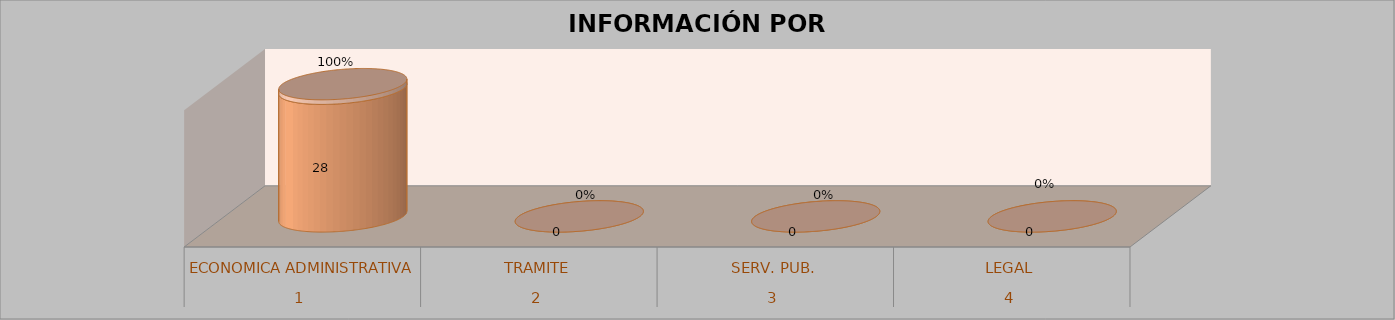
| Category | Series 0 | Series 1 | Series 2 | Series 3 |
|---|---|---|---|---|
| 0 |  |  | 28 | 1 |
| 1 |  |  | 0 | 0 |
| 2 |  |  | 0 | 0 |
| 3 |  |  | 0 | 0 |